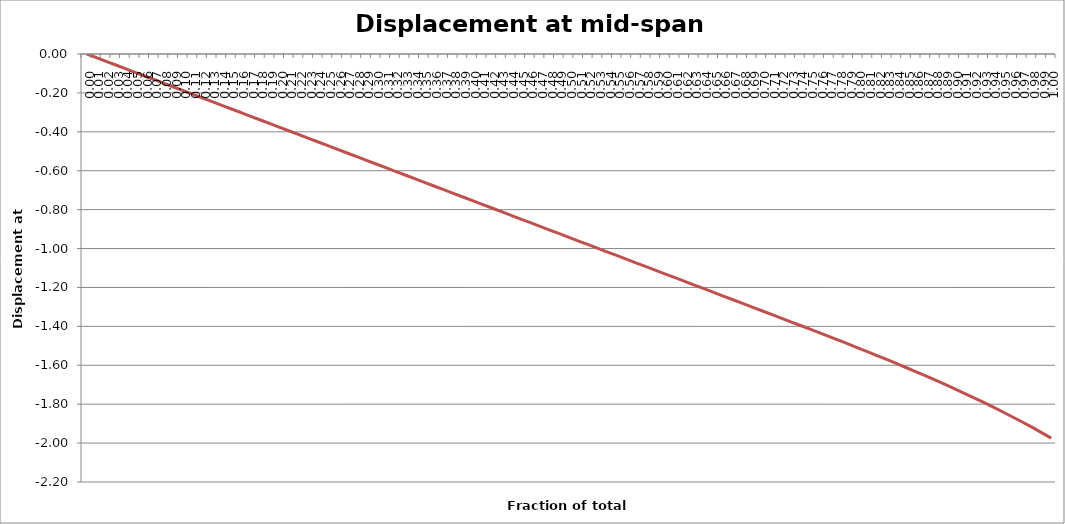
| Category | Displacement at mid-span [mm] |
|---|---|
| 0.0 | 0 |
| 0.01 | -0.019 |
| 0.02 | -0.038 |
| 0.03 | -0.057 |
| 0.04 | -0.075 |
| 0.05 | -0.094 |
| 0.06 | -0.113 |
| 0.06999999999999999 | -0.132 |
| 0.08 | -0.151 |
| 0.09 | -0.17 |
| 0.1 | -0.188 |
| 0.11000000000000001 | -0.207 |
| 0.12 | -0.226 |
| 0.13 | -0.245 |
| 0.13999999999999999 | -0.264 |
| 0.15 | -0.283 |
| 0.16 | -0.302 |
| 0.16999999999999998 | -0.32 |
| 0.18 | -0.339 |
| 0.19 | -0.358 |
| 0.2 | -0.377 |
| 0.21000000000000002 | -0.396 |
| 0.22000000000000003 | -0.415 |
| 0.22999999999999998 | -0.434 |
| 0.24 | -0.452 |
| 0.25 | -0.471 |
| 0.26 | -0.49 |
| 0.27 | -0.509 |
| 0.27999999999999997 | -0.528 |
| 0.29 | -0.547 |
| 0.3 | -0.566 |
| 0.31 | -0.584 |
| 0.32 | -0.603 |
| 0.32999999999999996 | -0.622 |
| 0.33999999999999997 | -0.641 |
| 0.35 | -0.66 |
| 0.36 | -0.679 |
| 0.37 | -0.697 |
| 0.38 | -0.716 |
| 0.39 | -0.735 |
| 0.4 | -0.754 |
| 0.41 | -0.773 |
| 0.42000000000000004 | -0.792 |
| 0.43 | -0.811 |
| 0.44000000000000006 | -0.829 |
| 0.45 | -0.848 |
| 0.45999999999999996 | -0.867 |
| 0.47000000000000003 | -0.886 |
| 0.48 | -0.905 |
| 0.49000000000000005 | -0.924 |
| 0.5 | -0.943 |
| 0.51 | -0.961 |
| 0.52 | -0.98 |
| 0.53 | -0.999 |
| 0.54 | -1.018 |
| 0.55 | -1.037 |
| 0.5599999999999999 | -1.056 |
| 0.5700000000000001 | -1.074 |
| 0.58 | -1.093 |
| 0.5900000000000001 | -1.112 |
| 0.6 | -1.131 |
| 0.61 | -1.15 |
| 0.62 | -1.169 |
| 0.63 | -1.188 |
| 0.64 | -1.206 |
| 0.65 | -1.225 |
| 0.6599999999999999 | -1.244 |
| 0.67 | -1.263 |
| 0.6799999999999999 | -1.282 |
| 0.6900000000000001 | -1.301 |
| 0.7 | -1.32 |
| 0.71 | -1.339 |
| 0.72 | -1.358 |
| 0.73 | -1.376 |
| 0.74 | -1.396 |
| 0.75 | -1.414 |
| 0.76 | -1.434 |
| 0.77 | -1.453 |
| 0.78 | -1.472 |
| 0.79 | -1.492 |
| 0.8 | -1.511 |
| 0.8099999999999999 | -1.531 |
| 0.82 | -1.551 |
| 0.8300000000000001 | -1.571 |
| 0.8400000000000001 | -1.592 |
| 0.85 | -1.613 |
| 0.86 | -1.634 |
| 0.8699999999999999 | -1.655 |
| 0.8800000000000001 | -1.677 |
| 0.89 | -1.699 |
| 0.9 | -1.721 |
| 0.9099999999999999 | -1.744 |
| 0.9199999999999999 | -1.767 |
| 0.93 | -1.791 |
| 0.9400000000000001 | -1.815 |
| 0.95 | -1.84 |
| 0.96 | -1.866 |
| 0.97 | -1.892 |
| 0.9800000000000001 | -1.918 |
| 0.99 | -1.946 |
| 1.0 | -1.974 |